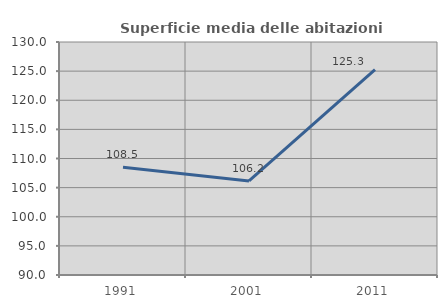
| Category | Superficie media delle abitazioni occupate |
|---|---|
| 1991.0 | 108.505 |
| 2001.0 | 106.157 |
| 2011.0 | 125.264 |